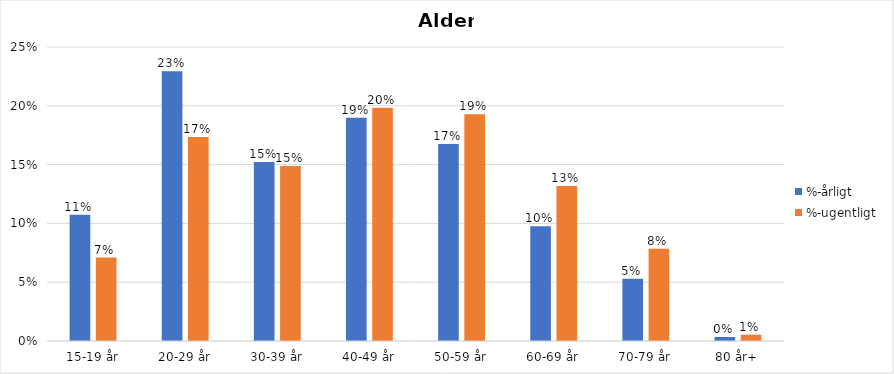
| Category | %-årligt | %-ugentligt |
|---|---|---|
| 15-19 år | 0.107 | 0.071 |
| 20-29 år | 0.229 | 0.173 |
| 30-39 år | 0.152 | 0.149 |
| 40-49 år | 0.19 | 0.198 |
| 50-59 år | 0.168 | 0.193 |
| 60-69 år | 0.098 | 0.132 |
| 70-79 år | 0.053 | 0.078 |
| 80 år+ | 0.003 | 0.005 |